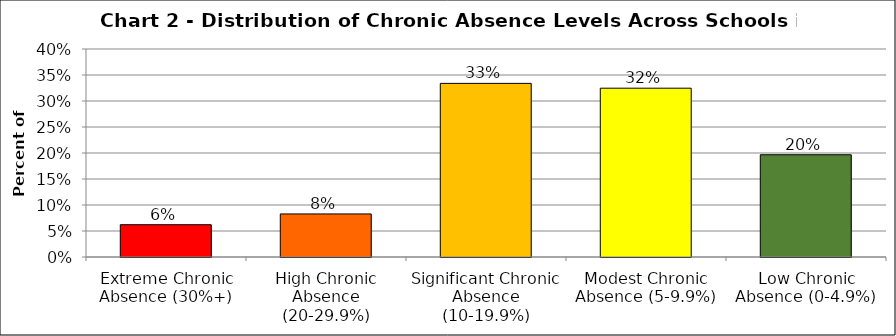
| Category | Series 1 |
|---|---|
| Extreme Chronic Absence (30%+) | 0.062 |
| High Chronic Absence (20-29.9%) | 0.083 |
| Significant Chronic Absence (10-19.9%) | 0.334 |
| Modest Chronic Absence (5-9.9%) | 0.325 |
| Low Chronic Absence (0-4.9%) | 0.197 |